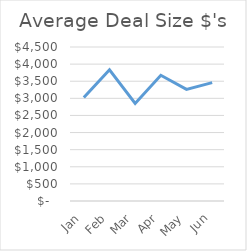
| Category | Average Deal Size $'s |
|---|---|
| Jan | 3025 |
| Feb | 3833.333 |
| Mar | 2848.837 |
| Apr | 3673.913 |
| May | 3262.5 |
| Jun | 3457.692 |